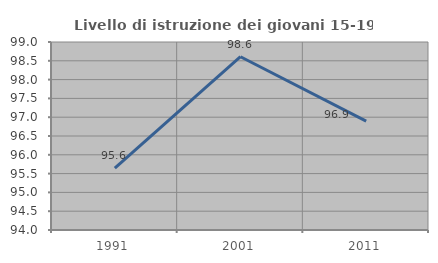
| Category | Livello di istruzione dei giovani 15-19 anni |
|---|---|
| 1991.0 | 95.644 |
| 2001.0 | 98.608 |
| 2011.0 | 96.897 |